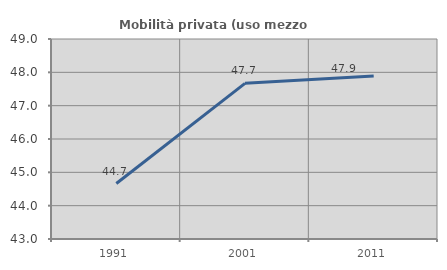
| Category | Mobilità privata (uso mezzo privato) |
|---|---|
| 1991.0 | 44.664 |
| 2001.0 | 47.67 |
| 2011.0 | 47.892 |